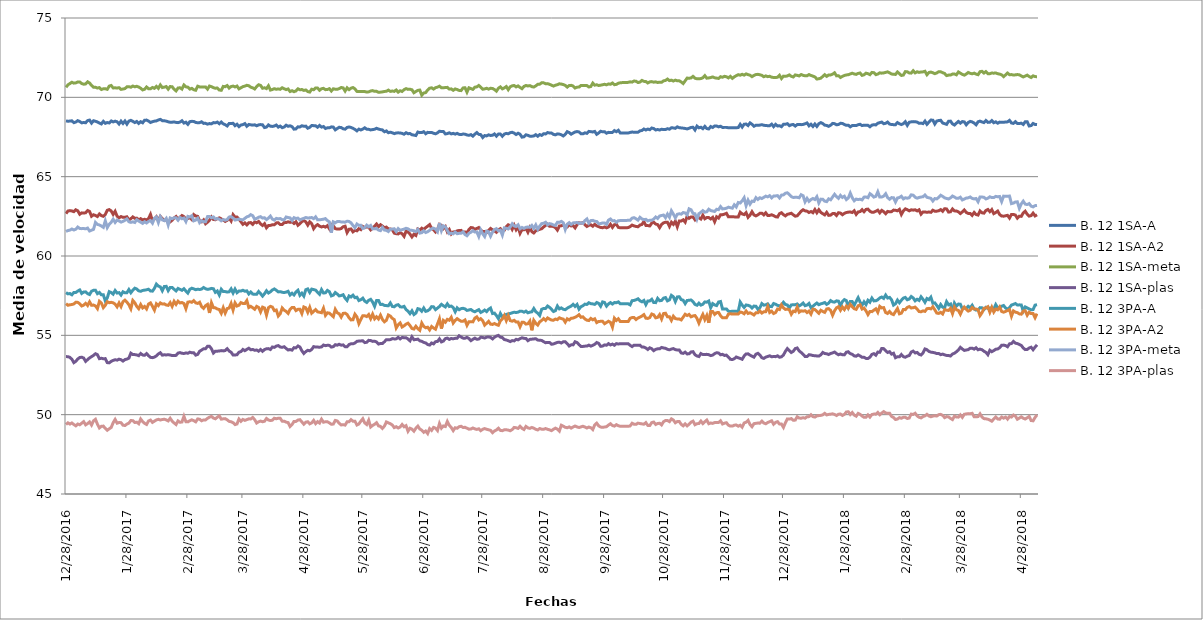
| Category | B. 12 1SA-A | B. 12 1SA-A2 | B. 12 1SA-meta | B. 12 1SA-plas | B. 12 3PA-A | B. 12 3PA-A2 | B. 12 3PA-meta | B. 12 3PA-plas |
|---|---|---|---|---|---|---|---|---|
| 28/12/2016 | 68.518 | 62.671 | 70.632 | 53.658 | 57.693 | 56.996 | 61.549 | 49.381 |
| 29/12/2016 | 68.494 | 62.836 | 70.789 | 53.657 | 57.614 | 56.893 | 61.604 | 49.485 |
| 30/12/2016 | 68.504 | 62.859 | 70.868 | 53.612 | 57.634 | 56.926 | 61.632 | 49.408 |
| 31/12/2016 | 68.52 | 62.84 | 70.95 | 53.494 | 57.553 | 56.941 | 61.7 | 49.478 |
| 01/01/2017 | 68.403 | 62.795 | 70.894 | 53.278 | 57.699 | 56.978 | 61.64 | 49.378 |
| 02/01/2017 | 68.444 | 62.913 | 70.912 | 53.364 | 57.697 | 57.085 | 61.688 | 49.295 |
| 03/01/2017 | 68.531 | 62.849 | 70.971 | 53.509 | 57.791 | 57.077 | 61.824 | 49.409 |
| 04/01/2017 | 68.473 | 62.631 | 70.966 | 53.603 | 57.861 | 56.989 | 61.736 | 49.364 |
| 05/01/2017 | 68.39 | 62.718 | 70.87 | 53.621 | 57.641 | 56.849 | 61.724 | 49.462 |
| 06/01/2017 | 68.415 | 62.706 | 70.827 | 53.57 | 57.732 | 56.904 | 61.732 | 49.56 |
| 07/01/2017 | 68.396 | 62.727 | 70.843 | 53.36 | 57.739 | 57.015 | 61.712 | 49.359 |
| 08/01/2017 | 68.533 | 62.865 | 70.979 | 53.47 | 57.629 | 56.882 | 61.76 | 49.44 |
| 09/01/2017 | 68.564 | 62.805 | 70.902 | 53.579 | 57.571 | 57.11 | 61.576 | 49.541 |
| 10/01/2017 | 68.376 | 62.505 | 70.751 | 53.657 | 57.78 | 56.893 | 61.628 | 49.346 |
| 11/01/2017 | 68.525 | 62.599 | 70.635 | 53.737 | 57.837 | 56.908 | 61.675 | 49.611 |
| 12/01/2017 | 68.49 | 62.555 | 70.634 | 53.84 | 57.841 | 56.853 | 62.118 | 49.708 |
| 13/01/2017 | 68.447 | 62.486 | 70.586 | 53.784 | 57.627 | 56.684 | 61.988 | 49.4 |
| 14/01/2017 | 68.384 | 62.651 | 70.613 | 53.528 | 57.703 | 57.143 | 61.957 | 49.166 |
| 15/01/2017 | 68.323 | 62.546 | 70.494 | 53.555 | 57.553 | 57.037 | 61.888 | 49.267 |
| 16/01/2017 | 68.486 | 62.502 | 70.538 | 53.524 | 57.561 | 56.746 | 61.806 | 49.279 |
| 17/01/2017 | 68.363 | 62.618 | 70.541 | 53.532 | 57.168 | 56.893 | 62.217 | 49.133 |
| 18/01/2017 | 68.412 | 62.881 | 70.504 | 53.28 | 57.362 | 57.121 | 61.791 | 49.018 |
| 19/01/2017 | 68.387 | 62.925 | 70.707 | 53.266 | 57.754 | 57.055 | 62.004 | 49.11 |
| 20/01/2017 | 68.511 | 62.838 | 70.747 | 53.362 | 57.697 | 57.081 | 62.124 | 49.194 |
| 21/01/2017 | 68.449 | 62.623 | 70.592 | 53.421 | 57.595 | 57.048 | 62.319 | 49.493 |
| 22/01/2017 | 68.499 | 62.817 | 70.599 | 53.461 | 57.824 | 56.967 | 62.115 | 49.698 |
| 23/01/2017 | 68.459 | 62.507 | 70.586 | 53.439 | 57.665 | 56.798 | 62.265 | 49.463 |
| 24/01/2017 | 68.32 | 62.409 | 70.609 | 53.498 | 57.691 | 57.04 | 62.212 | 49.504 |
| 25/01/2017 | 68.497 | 62.484 | 70.501 | 53.464 | 57.539 | 56.812 | 62.136 | 49.496 |
| 26/01/2017 | 68.353 | 62.436 | 70.524 | 53.377 | 57.746 | 57.121 | 62.18 | 49.336 |
| 27/01/2017 | 68.508 | 62.444 | 70.55 | 53.473 | 57.684 | 57.219 | 62.252 | 49.315 |
| 28/01/2017 | 68.312 | 62.472 | 70.663 | 53.503 | 57.689 | 57.095 | 62.338 | 49.409 |
| 29/01/2017 | 68.501 | 62.276 | 70.674 | 53.562 | 57.886 | 56.927 | 62.158 | 49.463 |
| 30/01/2017 | 68.549 | 62.35 | 70.635 | 53.874 | 57.685 | 56.675 | 62.12 | 49.632 |
| 31/01/2017 | 68.486 | 62.463 | 70.712 | 53.789 | 57.844 | 57.197 | 62.154 | 49.622 |
| 01/02/2017 | 68.411 | 62.374 | 70.664 | 53.786 | 57.972 | 57.055 | 62.112 | 49.504 |
| 02/02/2017 | 68.48 | 62.387 | 70.695 | 53.765 | 57.92 | 56.825 | 62.287 | 49.526 |
| 03/02/2017 | 68.355 | 62.273 | 70.647 | 53.718 | 57.804 | 56.679 | 62.201 | 49.431 |
| 04/02/2017 | 68.464 | 62.353 | 70.574 | 53.856 | 57.775 | 56.942 | 62.131 | 49.724 |
| 05/02/2017 | 68.395 | 62.274 | 70.468 | 53.76 | 57.828 | 56.726 | 62.056 | 49.562 |
| 06/02/2017 | 68.558 | 62.316 | 70.507 | 53.743 | 57.848 | 56.821 | 62.16 | 49.453 |
| 07/02/2017 | 68.566 | 62.267 | 70.653 | 53.849 | 57.871 | 56.664 | 62.082 | 49.383 |
| 08/02/2017 | 68.504 | 62.363 | 70.543 | 53.716 | 57.905 | 56.971 | 62.181 | 49.604 |
| 09/02/2017 | 68.414 | 62.62 | 70.54 | 53.611 | 57.794 | 57.044 | 62.228 | 49.658 |
| 10/02/2017 | 68.465 | 62.214 | 70.622 | 53.593 | 57.786 | 56.832 | 62.07 | 49.513 |
| 11/02/2017 | 68.498 | 62.335 | 70.566 | 53.629 | 57.961 | 56.588 | 62.375 | 49.592 |
| 12/02/2017 | 68.515 | 62.473 | 70.694 | 53.704 | 58.232 | 56.989 | 62.456 | 49.669 |
| 13/02/2017 | 68.574 | 62.259 | 70.566 | 53.827 | 58.105 | 56.872 | 62.107 | 49.707 |
| 14/02/2017 | 68.61 | 62.493 | 70.78 | 53.903 | 58.053 | 57.044 | 62.478 | 49.663 |
| 15/02/2017 | 68.529 | 62.365 | 70.616 | 53.752 | 57.81 | 56.971 | 62.276 | 49.694 |
| 16/02/2017 | 68.523 | 62.245 | 70.641 | 53.774 | 58.075 | 56.985 | 62.228 | 49.713 |
| 17/02/2017 | 68.499 | 62.285 | 70.68 | 53.763 | 58.088 | 56.909 | 62.369 | 49.672 |
| 18/02/2017 | 68.457 | 62.186 | 70.514 | 53.782 | 57.818 | 56.889 | 61.956 | 49.605 |
| 19/02/2017 | 68.432 | 62.152 | 70.679 | 53.761 | 58.016 | 57.061 | 62.399 | 49.771 |
| 20/02/2017 | 68.434 | 62.251 | 70.67 | 53.724 | 58.019 | 56.824 | 62.351 | 49.595 |
| 21/02/2017 | 68.448 | 62.396 | 70.512 | 53.721 | 57.905 | 57.14 | 62.413 | 49.478 |
| 22/02/2017 | 68.42 | 62.489 | 70.407 | 53.738 | 57.8 | 56.953 | 62.407 | 49.378 |
| 23/02/2017 | 68.405 | 62.314 | 70.586 | 53.882 | 57.956 | 57.151 | 62.257 | 49.607 |
| 24/02/2017 | 68.443 | 62.436 | 70.603 | 53.912 | 57.897 | 57.04 | 62.432 | 49.519 |
| 25/02/2017 | 68.523 | 62.551 | 70.521 | 53.871 | 57.838 | 57.068 | 62.346 | 49.54 |
| 26/02/2017 | 68.378 | 62.483 | 70.778 | 53.855 | 57.938 | 57.007 | 62.393 | 49.897 |
| 27/02/2017 | 68.432 | 62.312 | 70.662 | 53.89 | 57.79 | 56.68 | 62.171 | 49.557 |
| 28/02/2017 | 68.296 | 62.359 | 70.642 | 53.872 | 57.666 | 57.094 | 62.496 | 49.547 |
| 01/03/2017 | 68.466 | 62.425 | 70.515 | 53.937 | 57.9 | 57.119 | 62.46 | 49.617 |
| 02/03/2017 | 68.487 | 62.299 | 70.566 | 53.898 | 57.969 | 57.083 | 62.536 | 49.674 |
| 03/03/2017 | 68.48 | 62.609 | 70.479 | 53.905 | 57.93 | 57.186 | 62.215 | 49.622 |
| 04/03/2017 | 68.416 | 62.521 | 70.446 | 53.753 | 57.874 | 57.046 | 62.264 | 49.548 |
| 05/03/2017 | 68.399 | 62.498 | 70.703 | 53.798 | 57.908 | 57.011 | 62.382 | 49.729 |
| 06/03/2017 | 68.405 | 62.208 | 70.658 | 53.997 | 57.888 | 57.082 | 62.097 | 49.711 |
| 07/03/2017 | 68.459 | 62.154 | 70.648 | 54.072 | 57.918 | 56.811 | 62.222 | 49.616 |
| 08/03/2017 | 68.358 | 62.277 | 70.657 | 54.156 | 58.013 | 56.7 | 62.156 | 49.67 |
| 09/03/2017 | 68.36 | 62.032 | 70.657 | 54.156 | 57.939 | 56.871 | 62.156 | 49.67 |
| 10/03/2017 | 68.311 | 62.131 | 70.519 | 54.311 | 57.897 | 56.95 | 62.483 | 49.767 |
| 11/03/2017 | 68.347 | 62.251 | 70.712 | 54.309 | 57.919 | 56.411 | 62.486 | 49.842 |
| 12/03/2017 | 68.329 | 62.459 | 70.674 | 54.157 | 57.957 | 57.05 | 62.408 | 49.891 |
| 13/03/2017 | 68.408 | 62.301 | 70.609 | 53.886 | 57.936 | 56.746 | 62.462 | 49.787 |
| 14/03/2017 | 68.393 | 62.287 | 70.574 | 54.003 | 57.709 | 56.732 | 62.326 | 49.74 |
| 15/03/2017 | 68.44 | 62.352 | 70.589 | 54.001 | 57.795 | 56.658 | 62.362 | 49.84 |
| 16/03/2017 | 68.337 | 62.406 | 70.463 | 54.013 | 57.547 | 56.63 | 62.312 | 49.923 |
| 17/03/2017 | 68.444 | 62.34 | 70.443 | 54.038 | 57.904 | 56.388 | 62.218 | 49.718 |
| 18/03/2017 | 68.328 | 62.271 | 70.687 | 54.019 | 57.758 | 56.738 | 62.299 | 49.739 |
| 19/03/2017 | 68.276 | 62.18 | 70.669 | 54.041 | 57.757 | 56.406 | 62.255 | 49.749 |
| 20/03/2017 | 68.193 | 62.249 | 70.743 | 54.157 | 57.73 | 56.685 | 62.295 | 49.677 |
| 21/03/2017 | 68.353 | 62.396 | 70.583 | 54.011 | 57.744 | 56.719 | 62.454 | 49.577 |
| 22/03/2017 | 68.348 | 62.209 | 70.68 | 53.936 | 57.927 | 57.01 | 62.48 | 49.553 |
| 23/03/2017 | 68.366 | 62.607 | 70.71 | 53.761 | 57.666 | 56.592 | 62.388 | 49.496 |
| 24/03/2017 | 68.213 | 62.45 | 70.656 | 53.762 | 57.914 | 57.046 | 62.266 | 49.375 |
| 25/03/2017 | 68.305 | 62.458 | 70.711 | 53.776 | 57.688 | 56.846 | 62.289 | 49.413 |
| 26/03/2017 | 68.155 | 62.316 | 70.53 | 53.936 | 57.791 | 56.899 | 62.326 | 49.724 |
| 27/03/2017 | 68.253 | 62.159 | 70.602 | 53.974 | 57.791 | 57.062 | 62.296 | 49.583 |
| 28/03/2017 | 68.28 | 61.996 | 70.674 | 54.109 | 57.84 | 57.007 | 62.278 | 49.699 |
| 29/03/2017 | 68.346 | 62.085 | 70.705 | 54.034 | 57.777 | 57.007 | 62.373 | 49.639 |
| 30/03/2017 | 68.176 | 61.958 | 70.759 | 54.114 | 57.803 | 57.19 | 62.464 | 49.687 |
| 31/03/2017 | 68.291 | 62.096 | 70.73 | 54.187 | 57.61 | 56.755 | 62.51 | 49.736 |
| 01/04/2017 | 68.268 | 62.105 | 70.64 | 54.09 | 57.731 | 56.827 | 62.607 | 49.732 |
| 02/04/2017 | 68.248 | 61.994 | 70.599 | 54.109 | 57.598 | 56.742 | 62.542 | 49.823 |
| 03/04/2017 | 68.267 | 62.149 | 70.525 | 54.059 | 57.592 | 56.644 | 62.318 | 49.686 |
| 04/04/2017 | 68.205 | 62.094 | 70.679 | 54.075 | 57.586 | 56.824 | 62.37 | 49.473 |
| 05/04/2017 | 68.263 | 62.174 | 70.792 | 54.002 | 57.763 | 56.758 | 62.442 | 49.55 |
| 06/04/2017 | 68.283 | 62.026 | 70.751 | 54.106 | 57.629 | 56.477 | 62.477 | 49.595 |
| 07/04/2017 | 68.269 | 61.924 | 70.572 | 53.995 | 57.472 | 56.778 | 62.39 | 49.555 |
| 08/04/2017 | 68.096 | 62.035 | 70.602 | 54.104 | 57.621 | 56.725 | 62.412 | 49.586 |
| 09/04/2017 | 68.125 | 61.779 | 70.551 | 54.152 | 57.812 | 56.275 | 62.295 | 49.759 |
| 10/04/2017 | 68.261 | 61.918 | 70.728 | 54.164 | 57.667 | 56.739 | 62.39 | 49.663 |
| 11/04/2017 | 68.182 | 61.93 | 70.458 | 54.107 | 57.745 | 56.825 | 62.513 | 49.629 |
| 12/04/2017 | 68.166 | 61.97 | 70.494 | 54.266 | 57.86 | 56.782 | 62.326 | 49.652 |
| 13/04/2017 | 68.193 | 61.968 | 70.545 | 54.241 | 57.924 | 56.555 | 62.261 | 49.774 |
| 14/04/2017 | 68.255 | 62.087 | 70.507 | 54.324 | 57.84 | 56.594 | 62.371 | 49.743 |
| 15/04/2017 | 68.123 | 62.1 | 70.531 | 54.353 | 57.738 | 56.218 | 62.342 | 49.774 |
| 16/04/2017 | 68.187 | 61.979 | 70.506 | 54.262 | 57.752 | 56.36 | 62.361 | 49.769 |
| 17/04/2017 | 68.087 | 61.986 | 70.605 | 54.243 | 57.712 | 56.724 | 62.287 | 49.59 |
| 18/04/2017 | 68.132 | 62.107 | 70.541 | 54.282 | 57.698 | 56.584 | 62.277 | 49.592 |
| 19/04/2017 | 68.244 | 62.107 | 70.487 | 54.173 | 57.725 | 56.51 | 62.458 | 49.527 |
| 20/04/2017 | 68.174 | 62.155 | 70.528 | 54.075 | 57.777 | 56.383 | 62.423 | 49.501 |
| 21/04/2017 | 68.207 | 62.121 | 70.366 | 54.103 | 57.544 | 56.64 | 62.403 | 49.256 |
| 22/04/2017 | 68.153 | 62.152 | 70.418 | 54.068 | 57.652 | 56.76 | 62.239 | 49.374 |
| 23/04/2017 | 67.996 | 62.051 | 70.355 | 54.222 | 57.545 | 56.753 | 62.416 | 49.575 |
| 24/04/2017 | 68.01 | 62.161 | 70.404 | 54.207 | 57.735 | 56.558 | 62.361 | 49.574 |
| 25/04/2017 | 68.14 | 61.935 | 70.536 | 54.331 | 57.841 | 56.64 | 62.39 | 49.66 |
| 26/04/2017 | 68.134 | 62.035 | 70.477 | 54.263 | 57.526 | 56.643 | 62.271 | 49.683 |
| 27/04/2017 | 68.208 | 62.175 | 70.492 | 54.029 | 57.656 | 56.373 | 62.335 | 49.544 |
| 28/04/2017 | 68.177 | 62.228 | 70.435 | 53.858 | 57.473 | 56.789 | 62.371 | 49.398 |
| 29/04/2017 | 68.185 | 62.155 | 70.465 | 53.974 | 57.875 | 56.732 | 62.426 | 49.527 |
| 30/04/2017 | 68.054 | 61.946 | 70.364 | 54.057 | 57.926 | 56.452 | 62.394 | 49.556 |
| 01/05/2017 | 68.108 | 62.153 | 70.332 | 54.025 | 57.706 | 56.765 | 62.406 | 49.422 |
| 02/05/2017 | 68.225 | 62.042 | 70.513 | 54.11 | 57.915 | 56.397 | 62.423 | 49.484 |
| 03/05/2017 | 68.215 | 61.723 | 70.478 | 54.288 | 57.883 | 56.51 | 62.355 | 49.639 |
| 04/05/2017 | 68.206 | 61.893 | 70.593 | 54.258 | 57.849 | 56.623 | 62.468 | 49.435 |
| 05/05/2017 | 68.116 | 61.98 | 70.586 | 54.261 | 57.711 | 56.481 | 62.277 | 49.562 |
| 06/05/2017 | 68.229 | 61.88 | 70.445 | 54.25 | 57.584 | 56.455 | 62.281 | 49.473 |
| 07/05/2017 | 68.122 | 61.831 | 70.541 | 54.272 | 57.881 | 56.426 | 62.3 | 49.714 |
| 08/05/2017 | 68.159 | 61.871 | 70.567 | 54.39 | 57.667 | 56.706 | 62.319 | 49.525 |
| 09/05/2017 | 68.039 | 61.821 | 70.484 | 54.35 | 57.682 | 56.258 | 62.358 | 49.555 |
| 10/05/2017 | 68.079 | 61.911 | 70.493 | 54.375 | 57.83 | 56.42 | 62.232 | 49.552 |
| 11/05/2017 | 68.079 | 61.715 | 70.547 | 54.367 | 57.751 | 56.398 | 62.148 | 49.482 |
| 12/05/2017 | 68.138 | 61.988 | 70.398 | 54.259 | 57.484 | 56.287 | 61.469 | 49.393 |
| 13/05/2017 | 68.124 | 61.907 | 70.538 | 54.29 | 57.533 | 56.175 | 62.155 | 49.409 |
| 14/05/2017 | 67.952 | 61.729 | 70.512 | 54.41 | 57.699 | 56.637 | 62.094 | 49.636 |
| 15/05/2017 | 68.037 | 61.695 | 70.502 | 54.378 | 57.602 | 56.424 | 62.171 | 49.601 |
| 16/05/2017 | 68.113 | 61.695 | 70.553 | 54.438 | 57.484 | 56.357 | 62.177 | 49.46 |
| 17/05/2017 | 68.095 | 61.73 | 70.618 | 54.377 | 57.509 | 56.15 | 62.145 | 49.352 |
| 18/05/2017 | 68.02 | 61.842 | 70.596 | 54.397 | 57.559 | 56.382 | 62.139 | 49.369 |
| 19/05/2017 | 67.993 | 61.878 | 70.394 | 54.282 | 57.344 | 56.398 | 62.131 | 49.343 |
| 20/05/2017 | 68.099 | 61.477 | 70.599 | 54.281 | 57.2 | 56.315 | 62.192 | 49.547 |
| 21/05/2017 | 68.13 | 61.684 | 70.483 | 54.418 | 57.483 | 56.105 | 62.176 | 49.552 |
| 22/05/2017 | 68.104 | 61.704 | 70.576 | 54.468 | 57.416 | 55.972 | 62.09 | 49.685 |
| 23/05/2017 | 68.046 | 61.523 | 70.618 | 54.465 | 57.531 | 55.984 | 61.926 | 49.589 |
| 24/05/2017 | 67.98 | 61.618 | 70.535 | 54.516 | 57.372 | 56.33 | 61.779 | 49.591 |
| 25/05/2017 | 67.885 | 61.589 | 70.374 | 54.621 | 57.403 | 56.167 | 62.016 | 49.35 |
| 26/05/2017 | 67.996 | 61.72 | 70.368 | 54.64 | 57.192 | 55.739 | 61.93 | 49.412 |
| 27/05/2017 | 67.944 | 61.663 | 70.374 | 54.648 | 57.245 | 56.003 | 61.933 | 49.591 |
| 28/05/2017 | 67.997 | 61.859 | 70.368 | 54.658 | 57.341 | 56.239 | 61.732 | 49.742 |
| 29/05/2017 | 68.08 | 61.786 | 70.364 | 54.541 | 57.154 | 56.233 | 61.79 | 49.478 |
| 30/05/2017 | 67.992 | 61.838 | 70.33 | 54.563 | 57.073 | 56.182 | 61.946 | 49.38 |
| 31/05/2017 | 67.984 | 61.814 | 70.347 | 54.684 | 57.203 | 56.309 | 61.841 | 49.647 |
| 01/06/2017 | 67.945 | 61.646 | 70.398 | 54.673 | 57.27 | 56.049 | 61.924 | 49.222 |
| 02/06/2017 | 67.966 | 61.749 | 70.423 | 54.619 | 57.098 | 56.336 | 61.71 | 49.321 |
| 03/06/2017 | 67.987 | 61.879 | 70.38 | 54.626 | 56.828 | 56.04 | 61.717 | 49.393 |
| 04/06/2017 | 68.047 | 62.018 | 70.378 | 54.584 | 57.191 | 56.17 | 61.729 | 49.491 |
| 05/06/2017 | 68.001 | 61.848 | 70.315 | 54.449 | 57.195 | 56.034 | 61.634 | 49.293 |
| 06/06/2017 | 67.966 | 61.975 | 70.328 | 54.487 | 56.946 | 56.272 | 61.599 | 49.262 |
| 07/06/2017 | 67.947 | 61.884 | 70.343 | 54.483 | 56.954 | 55.997 | 61.803 | 49.137 |
| 08/06/2017 | 67.829 | 61.789 | 70.371 | 54.596 | 56.887 | 55.852 | 61.637 | 49.278 |
| 09/06/2017 | 67.882 | 61.821 | 70.382 | 54.726 | 56.874 | 55.951 | 61.615 | 49.542 |
| 10/06/2017 | 67.769 | 61.708 | 70.454 | 54.718 | 56.863 | 56.281 | 61.541 | 49.485 |
| 11/06/2017 | 67.803 | 61.709 | 70.376 | 54.73 | 57.04 | 56.216 | 61.691 | 49.429 |
| 12/06/2017 | 67.765 | 61.659 | 70.397 | 54.792 | 56.821 | 56.071 | 61.694 | 49.353 |
| 13/06/2017 | 67.714 | 61.439 | 70.375 | 54.774 | 56.797 | 55.994 | 61.717 | 49.183 |
| 14/06/2017 | 67.756 | 61.406 | 70.463 | 54.777 | 56.9 | 55.463 | 61.541 | 49.241 |
| 15/06/2017 | 67.761 | 61.392 | 70.325 | 54.871 | 56.932 | 55.667 | 61.729 | 49.161 |
| 16/06/2017 | 67.755 | 61.475 | 70.414 | 54.776 | 56.8 | 55.781 | 61.615 | 49.222 |
| 17/06/2017 | 67.728 | 61.402 | 70.37 | 54.864 | 56.784 | 55.525 | 61.662 | 49.381 |
| 18/06/2017 | 67.676 | 61.238 | 70.487 | 54.85 | 56.826 | 55.602 | 61.694 | 49.235 |
| 19/06/2017 | 67.768 | 61.561 | 70.55 | 54.849 | 56.624 | 55.707 | 61.747 | 49.307 |
| 20/06/2017 | 67.708 | 61.51 | 70.502 | 54.772 | 56.526 | 55.765 | 61.712 | 48.955 |
| 21/06/2017 | 67.719 | 61.381 | 70.511 | 54.653 | 56.368 | 55.619 | 61.628 | 49.146 |
| 22/06/2017 | 67.643 | 61.202 | 70.476 | 54.906 | 56.546 | 55.433 | 61.619 | 49.089 |
| 23/06/2017 | 67.617 | 61.37 | 70.29 | 54.724 | 56.31 | 55.396 | 61.59 | 48.958 |
| 24/06/2017 | 67.593 | 61.293 | 70.37 | 54.733 | 56.4 | 55.573 | 61.532 | 49.144 |
| 25/06/2017 | 67.813 | 61.699 | 70.438 | 54.762 | 56.682 | 55.421 | 61.676 | 49.278 |
| 26/06/2017 | 67.776 | 61.628 | 70.458 | 54.653 | 56.649 | 55.318 | 61.442 | 49.095 |
| 27/06/2017 | 67.781 | 61.751 | 70.136 | 54.622 | 56.523 | 55.776 | 61.468 | 49.021 |
| 28/06/2017 | 67.836 | 61.666 | 70.272 | 54.555 | 56.723 | 55.563 | 61.586 | 48.887 |
| 29/06/2017 | 67.704 | 61.786 | 70.299 | 54.52 | 56.512 | 55.476 | 61.481 | 48.969 |
| 30/06/2017 | 67.792 | 61.879 | 70.464 | 54.421 | 56.548 | 55.512 | 61.532 | 48.808 |
| 01/07/2017 | 67.784 | 61.978 | 70.575 | 54.388 | 56.639 | 55.343 | 61.617 | 49.121 |
| 02/07/2017 | 67.788 | 61.746 | 70.6 | 54.516 | 56.808 | 55.557 | 61.718 | 49.009 |
| 03/07/2017 | 67.736 | 61.649 | 70.52 | 54.461 | 56.796 | 55.461 | 61.753 | 49.196 |
| 04/07/2017 | 67.702 | 61.515 | 70.607 | 54.601 | 56.622 | 55.386 | 61.695 | 49.149 |
| 05/07/2017 | 67.761 | 61.674 | 70.644 | 54.613 | 56.715 | 55.714 | 61.535 | 49 |
| 06/07/2017 | 67.864 | 61.999 | 70.704 | 54.777 | 56.817 | 56.042 | 62.076 | 49.438 |
| 07/07/2017 | 67.844 | 61.932 | 70.602 | 54.584 | 56.955 | 55.425 | 61.597 | 49.15 |
| 08/07/2017 | 67.847 | 61.728 | 70.607 | 54.638 | 56.864 | 55.937 | 61.899 | 49.289 |
| 09/07/2017 | 67.694 | 61.854 | 70.616 | 54.796 | 56.789 | 55.826 | 61.84 | 49.251 |
| 10/07/2017 | 67.715 | 61.519 | 70.628 | 54.824 | 56.986 | 56.006 | 61.61 | 49.57 |
| 11/07/2017 | 67.765 | 61.671 | 70.519 | 54.744 | 56.816 | 55.952 | 61.403 | 49.327 |
| 12/07/2017 | 67.697 | 61.392 | 70.533 | 54.802 | 56.846 | 56.137 | 61.441 | 49.195 |
| 13/07/2017 | 67.728 | 61.515 | 70.444 | 54.783 | 56.749 | 55.774 | 61.4 | 48.996 |
| 14/07/2017 | 67.682 | 61.529 | 70.528 | 54.811 | 56.487 | 55.94 | 61.509 | 49.176 |
| 15/07/2017 | 67.73 | 61.585 | 70.492 | 54.816 | 56.729 | 56.051 | 61.403 | 49.143 |
| 16/07/2017 | 67.667 | 61.608 | 70.436 | 54.971 | 56.613 | 55.964 | 61.431 | 49.241 |
| 17/07/2017 | 67.652 | 61.614 | 70.425 | 54.895 | 56.683 | 55.887 | 61.428 | 49.269 |
| 18/07/2017 | 67.685 | 61.489 | 70.593 | 54.824 | 56.703 | 55.89 | 61.522 | 49.195 |
| 19/07/2017 | 67.679 | 61.515 | 70.606 | 54.817 | 56.667 | 55.967 | 61.354 | 49.201 |
| 20/07/2017 | 67.626 | 61.467 | 70.325 | 54.87 | 56.57 | 55.634 | 61.276 | 49.146 |
| 21/07/2017 | 67.607 | 61.666 | 70.601 | 54.799 | 56.6 | 55.861 | 61.432 | 49.086 |
| 22/07/2017 | 67.649 | 61.793 | 70.551 | 54.663 | 56.628 | 55.859 | 61.497 | 49.095 |
| 23/07/2017 | 67.555 | 61.774 | 70.501 | 54.752 | 56.534 | 55.85 | 61.596 | 49.162 |
| 24/07/2017 | 67.678 | 61.675 | 70.637 | 54.823 | 56.484 | 56.079 | 61.509 | 49.106 |
| 25/07/2017 | 67.778 | 61.736 | 70.658 | 54.754 | 56.557 | 56.163 | 61.519 | 49.071 |
| 26/07/2017 | 67.667 | 61.792 | 70.747 | 54.763 | 56.618 | 55.968 | 61.231 | 49.112 |
| 27/07/2017 | 67.65 | 61.625 | 70.643 | 54.878 | 56.442 | 56.049 | 61.642 | 48.993 |
| 28/07/2017 | 67.471 | 61.542 | 70.51 | 54.867 | 56.507 | 55.925 | 61.398 | 49.079 |
| 29/07/2017 | 67.591 | 61.546 | 70.533 | 54.829 | 56.592 | 55.645 | 61.228 | 49.125 |
| 30/07/2017 | 67.567 | 61.475 | 70.574 | 54.885 | 56.496 | 55.757 | 61.571 | 49.08 |
| 31/07/2017 | 67.636 | 61.618 | 70.516 | 54.897 | 56.642 | 55.882 | 61.528 | 49.046 |
| 01/08/2017 | 67.596 | 61.736 | 70.569 | 54.872 | 56.722 | 55.704 | 61.25 | 49.012 |
| 02/08/2017 | 67.611 | 61.65 | 70.56 | 54.774 | 56.373 | 55.688 | 61.506 | 48.864 |
| 03/08/2017 | 67.693 | 61.581 | 70.489 | 54.883 | 56.397 | 55.746 | 61.667 | 48.975 |
| 04/08/2017 | 67.553 | 61.495 | 70.39 | 54.956 | 56.245 | 55.679 | 61.724 | 49.037 |
| 05/08/2017 | 67.688 | 61.651 | 70.574 | 54.995 | 56.051 | 55.633 | 61.583 | 49.145 |
| 06/08/2017 | 67.683 | 61.724 | 70.66 | 54.884 | 56.378 | 55.916 | 61.629 | 49.007 |
| 07/08/2017 | 67.549 | 61.577 | 70.534 | 54.862 | 56.158 | 56.032 | 61.319 | 48.99 |
| 08/08/2017 | 67.685 | 61.624 | 70.591 | 54.733 | 56.245 | 56.25 | 61.773 | 49.049 |
| 09/08/2017 | 67.727 | 61.841 | 70.679 | 54.707 | 56.319 | 55.928 | 61.745 | 49.049 |
| 10/08/2017 | 67.702 | 61.968 | 70.483 | 54.662 | 56.354 | 56.244 | 61.703 | 49.028 |
| 11/08/2017 | 67.772 | 61.909 | 70.666 | 54.607 | 56.377 | 55.928 | 61.825 | 48.987 |
| 12/08/2017 | 67.799 | 61.678 | 70.726 | 54.668 | 56.419 | 55.891 | 62.03 | 49.061 |
| 13/08/2017 | 67.741 | 61.939 | 70.745 | 54.649 | 56.457 | 55.945 | 61.895 | 49.195 |
| 14/08/2017 | 67.657 | 61.656 | 70.658 | 54.747 | 56.437 | 55.84 | 61.858 | 49.178 |
| 15/08/2017 | 67.737 | 61.841 | 70.721 | 54.716 | 56.464 | 55.843 | 61.967 | 49.136 |
| 16/08/2017 | 67.675 | 61.429 | 70.624 | 54.79 | 56.525 | 55.543 | 61.711 | 49.268 |
| 17/08/2017 | 67.492 | 61.664 | 70.544 | 54.845 | 56.517 | 55.826 | 61.801 | 49.135 |
| 18/08/2017 | 67.514 | 61.651 | 70.691 | 54.81 | 56.458 | 55.817 | 61.741 | 49.065 |
| 19/08/2017 | 67.638 | 61.737 | 70.746 | 54.804 | 56.526 | 55.709 | 61.81 | 49.259 |
| 20/08/2017 | 67.605 | 61.496 | 70.717 | 54.662 | 56.421 | 55.731 | 61.828 | 49.167 |
| 21/08/2017 | 67.552 | 61.788 | 70.739 | 54.746 | 56.462 | 55.901 | 61.807 | 49.138 |
| 22/08/2017 | 67.549 | 61.534 | 70.673 | 54.759 | 56.483 | 55.318 | 61.925 | 49.194 |
| 23/08/2017 | 67.566 | 61.452 | 70.65 | 54.773 | 56.69 | 55.943 | 61.743 | 49.148 |
| 24/08/2017 | 67.647 | 61.59 | 70.724 | 54.787 | 56.49 | 55.764 | 61.958 | 49.075 |
| 25/08/2017 | 67.549 | 61.638 | 70.818 | 54.7 | 56.397 | 55.645 | 61.68 | 49.038 |
| 26/08/2017 | 67.653 | 61.684 | 70.83 | 54.694 | 56.253 | 55.852 | 61.88 | 49.126 |
| 27/08/2017 | 67.601 | 61.721 | 70.918 | 54.678 | 56.642 | 55.938 | 62.039 | 49.083 |
| 28/08/2017 | 67.707 | 61.829 | 70.914 | 54.601 | 56.694 | 56.06 | 62.066 | 49.081 |
| 29/08/2017 | 67.691 | 61.929 | 70.857 | 54.535 | 56.694 | 55.938 | 62.129 | 49.126 |
| 30/08/2017 | 67.779 | 62.008 | 70.864 | 54.554 | 56.847 | 56.096 | 61.961 | 49.077 |
| 31/08/2017 | 67.755 | 61.874 | 70.82 | 54.554 | 56.762 | 56.025 | 62.042 | 49.044 |
| 01/09/2017 | 67.75 | 61.881 | 70.767 | 54.438 | 56.639 | 55.961 | 62.012 | 48.994 |
| 02/09/2017 | 67.664 | 61.857 | 70.709 | 54.458 | 56.5 | 55.955 | 61.955 | 49.081 |
| 03/09/2017 | 67.637 | 61.787 | 70.764 | 54.506 | 56.554 | 56.025 | 61.922 | 49.151 |
| 04/09/2017 | 67.696 | 61.631 | 70.796 | 54.556 | 56.848 | 55.989 | 62.126 | 49.084 |
| 05/09/2017 | 67.681 | 61.892 | 70.853 | 54.565 | 56.666 | 56.107 | 62.12 | 48.966 |
| 06/09/2017 | 67.64 | 61.903 | 70.835 | 54.517 | 56.727 | 56.053 | 62.183 | 49.333 |
| 07/09/2017 | 67.567 | 61.946 | 70.805 | 54.594 | 56.645 | 56.022 | 62.095 | 49.272 |
| 08/09/2017 | 67.667 | 61.866 | 70.754 | 54.597 | 56.617 | 55.831 | 61.673 | 49.204 |
| 09/09/2017 | 67.839 | 61.832 | 70.645 | 54.479 | 56.709 | 56.042 | 62.009 | 49.176 |
| 10/09/2017 | 67.779 | 61.988 | 70.744 | 54.327 | 56.783 | 55.969 | 62.101 | 49.229 |
| 11/09/2017 | 67.677 | 61.894 | 70.755 | 54.402 | 56.843 | 56.076 | 61.985 | 49.152 |
| 12/09/2017 | 67.75 | 61.916 | 70.712 | 54.399 | 56.953 | 56.087 | 62.086 | 49.227 |
| 13/09/2017 | 67.814 | 61.771 | 70.589 | 54.595 | 56.821 | 56.14 | 62.098 | 49.283 |
| 14/09/2017 | 67.844 | 61.978 | 70.642 | 54.543 | 56.946 | 56.205 | 62.113 | 49.229 |
| 15/09/2017 | 67.818 | 62.094 | 70.645 | 54.412 | 56.654 | 56.301 | 62.048 | 49.191 |
| 16/09/2017 | 67.708 | 62.067 | 70.748 | 54.298 | 56.809 | 56.138 | 62.092 | 49.231 |
| 17/09/2017 | 67.702 | 62.105 | 70.753 | 54.3 | 56.864 | 56.166 | 62.057 | 49.269 |
| 18/09/2017 | 67.763 | 61.967 | 70.747 | 54.32 | 56.966 | 56.031 | 62.229 | 49.22 |
| 19/09/2017 | 67.731 | 61.864 | 70.741 | 54.321 | 56.945 | 55.955 | 62.334 | 49.161 |
| 20/09/2017 | 67.852 | 61.935 | 70.653 | 54.383 | 57.054 | 55.932 | 62.074 | 49.219 |
| 21/09/2017 | 67.836 | 61.966 | 70.683 | 54.318 | 56.997 | 56.068 | 62.231 | 49.179 |
| 22/09/2017 | 67.818 | 61.876 | 70.896 | 54.371 | 56.98 | 55.98 | 62.246 | 49.064 |
| 23/09/2017 | 67.852 | 61.993 | 70.768 | 54.433 | 56.95 | 56.042 | 62.186 | 49.355 |
| 24/09/2017 | 67.67 | 61.898 | 70.792 | 54.547 | 57.07 | 55.805 | 62.178 | 49.464 |
| 25/09/2017 | 67.754 | 61.849 | 70.745 | 54.492 | 57.012 | 55.873 | 62.038 | 49.294 |
| 26/09/2017 | 67.862 | 61.799 | 70.766 | 54.307 | 56.835 | 55.882 | 62.041 | 49.217 |
| 27/09/2017 | 67.825 | 61.781 | 70.794 | 54.325 | 57.108 | 55.882 | 62.083 | 49.206 |
| 28/09/2017 | 67.834 | 61.828 | 70.822 | 54.397 | 57.069 | 55.733 | 62.083 | 49.22 |
| 29/09/2017 | 67.74 | 61.775 | 70.786 | 54.374 | 56.842 | 55.812 | 61.997 | 49.243 |
| 30/09/2017 | 67.792 | 61.829 | 70.847 | 54.478 | 56.979 | 55.888 | 62.262 | 49.346 |
| 01/10/2017 | 67.787 | 61.999 | 70.823 | 54.395 | 57.062 | 55.817 | 62.332 | 49.429 |
| 02/10/2017 | 67.789 | 61.803 | 70.904 | 54.448 | 56.972 | 55.514 | 62.221 | 49.317 |
| 03/10/2017 | 67.904 | 61.972 | 70.797 | 54.374 | 57.065 | 56.081 | 62.229 | 49.278 |
| 04/10/2017 | 67.834 | 61.998 | 70.816 | 54.478 | 57.057 | 55.936 | 62.126 | 49.37 |
| 05/10/2017 | 67.922 | 61.806 | 70.89 | 54.453 | 57.108 | 56.045 | 62.224 | 49.302 |
| 06/10/2017 | 67.752 | 61.773 | 70.918 | 54.473 | 56.988 | 55.866 | 62.232 | 49.269 |
| 07/10/2017 | 67.752 | 61.778 | 70.929 | 54.473 | 56.988 | 55.866 | 62.232 | 49.269 |
| 08/10/2017 | 67.752 | 61.778 | 70.929 | 54.473 | 56.988 | 55.866 | 62.232 | 49.269 |
| 09/10/2017 | 67.752 | 61.778 | 70.929 | 54.473 | 56.988 | 55.866 | 62.232 | 49.269 |
| 10/10/2017 | 67.752 | 61.792 | 70.945 | 54.473 | 56.988 | 55.866 | 62.26 | 49.269 |
| 11/10/2017 | 67.787 | 61.854 | 70.976 | 54.371 | 56.918 | 56.073 | 62.249 | 49.288 |
| 12/10/2017 | 67.811 | 61.949 | 70.96 | 54.291 | 57.183 | 56.12 | 62.386 | 49.459 |
| 13/10/2017 | 67.801 | 61.896 | 71.029 | 54.383 | 57.199 | 56.117 | 62.415 | 49.399 |
| 14/10/2017 | 67.796 | 61.862 | 71.014 | 54.382 | 57.24 | 55.997 | 62.345 | 49.389 |
| 15/10/2017 | 67.802 | 61.841 | 70.931 | 54.371 | 57.304 | 56.092 | 62.26 | 49.466 |
| 16/10/2017 | 67.887 | 61.949 | 70.959 | 54.381 | 57.174 | 56.145 | 62.439 | 49.439 |
| 17/10/2017 | 67.91 | 61.988 | 71.067 | 54.263 | 57.113 | 56.218 | 62.336 | 49.42 |
| 18/10/2017 | 68.003 | 62.173 | 71.006 | 54.258 | 57.198 | 56.304 | 62.292 | 49.398 |
| 19/10/2017 | 67.94 | 61.925 | 70.998 | 54.202 | 56.934 | 56.081 | 62.31 | 49.499 |
| 20/10/2017 | 67.999 | 61.919 | 70.905 | 54.109 | 57.167 | 56.064 | 62.216 | 49.322 |
| 21/10/2017 | 67.961 | 61.894 | 70.975 | 54.216 | 57.169 | 56.123 | 62.253 | 49.314 |
| 22/10/2017 | 68.067 | 62.077 | 70.991 | 54.156 | 57.272 | 56.344 | 62.259 | 49.5 |
| 23/10/2017 | 68.032 | 62.126 | 70.955 | 54.036 | 57.066 | 56.296 | 62.324 | 49.534 |
| 24/10/2017 | 67.945 | 62.014 | 70.975 | 54.116 | 57.062 | 56.103 | 62.458 | 49.382 |
| 25/10/2017 | 67.971 | 61.98 | 70.937 | 54.148 | 57.328 | 56.131 | 62.369 | 49.441 |
| 26/10/2017 | 67.941 | 61.784 | 70.955 | 54.149 | 57.182 | 56.304 | 62.52 | 49.462 |
| 27/10/2017 | 67.988 | 61.991 | 70.947 | 54.236 | 57.196 | 56.028 | 62.553 | 49.355 |
| 28/10/2017 | 67.969 | 62.091 | 71.039 | 54.204 | 57.344 | 56.372 | 62.581 | 49.558 |
| 29/10/2017 | 67.969 | 62.129 | 71.064 | 54.181 | 57.38 | 56.393 | 62.413 | 49.631 |
| 30/10/2017 | 68.024 | 62.127 | 71.151 | 54.116 | 57.171 | 56.168 | 62.645 | 49.631 |
| 31/10/2017 | 67.99 | 61.868 | 71.054 | 54.088 | 57.233 | 56.173 | 62.447 | 49.562 |
| 01/11/2017 | 68.082 | 62.128 | 71.082 | 54.135 | 57.521 | 55.941 | 62.847 | 49.735 |
| 02/11/2017 | 68.072 | 61.997 | 71.027 | 54.164 | 57.43 | 56.205 | 62.64 | 49.662 |
| 03/11/2017 | 68.046 | 62.197 | 71.084 | 54.102 | 57.13 | 56.059 | 62.409 | 49.49 |
| 04/11/2017 | 68.14 | 61.839 | 71.04 | 54.075 | 57.42 | 56.031 | 62.629 | 49.569 |
| 05/11/2017 | 68.085 | 62.207 | 71.043 | 54.074 | 57.433 | 56.037 | 62.662 | 49.568 |
| 06/11/2017 | 68.072 | 62.204 | 70.968 | 53.889 | 57.249 | 55.972 | 62.637 | 49.388 |
| 07/11/2017 | 68.058 | 62.28 | 70.87 | 53.863 | 57.213 | 56.149 | 62.738 | 49.296 |
| 08/11/2017 | 68.039 | 62.133 | 71.039 | 53.941 | 57 | 56.329 | 62.711 | 49.422 |
| 09/11/2017 | 68.007 | 62.501 | 71.214 | 53.828 | 57.194 | 56.25 | 62.592 | 49.295 |
| 10/11/2017 | 68.052 | 62.376 | 71.201 | 53.837 | 57.211 | 56.317 | 62.973 | 49.4 |
| 11/11/2017 | 68.102 | 62.463 | 71.223 | 53.952 | 57.228 | 56.166 | 62.914 | 49.532 |
| 12/11/2017 | 68.113 | 62.458 | 71.319 | 53.97 | 57.118 | 56.222 | 62.688 | 49.594 |
| 13/11/2017 | 67.944 | 62.284 | 71.203 | 53.779 | 56.951 | 56.247 | 62.661 | 49.365 |
| 14/11/2017 | 68.186 | 62.451 | 71.168 | 53.7 | 56.897 | 56.07 | 62.322 | 49.431 |
| 15/11/2017 | 68.079 | 62.412 | 71.169 | 53.663 | 57.026 | 55.77 | 62.668 | 49.443 |
| 16/11/2017 | 68.115 | 62.331 | 71.182 | 53.852 | 56.904 | 56.062 | 62.753 | 49.596 |
| 17/11/2017 | 68.024 | 62.568 | 71.23 | 53.789 | 56.957 | 56.315 | 62.859 | 49.438 |
| 18/11/2017 | 68.169 | 62.346 | 71.366 | 53.795 | 57.105 | 55.992 | 62.761 | 49.553 |
| 19/11/2017 | 68.032 | 62.422 | 71.207 | 53.801 | 57.089 | 56.25 | 62.79 | 49.659 |
| 20/11/2017 | 68.008 | 62.422 | 71.223 | 53.783 | 57.161 | 55.792 | 62.949 | 49.428 |
| 21/11/2017 | 68.16 | 62.334 | 71.248 | 53.722 | 56.739 | 56.506 | 62.862 | 49.475 |
| 22/11/2017 | 68.1 | 62.435 | 71.285 | 53.754 | 56.999 | 56.5 | 62.833 | 49.451 |
| 23/11/2017 | 68.196 | 62.158 | 71.233 | 53.848 | 56.916 | 56.317 | 62.807 | 49.501 |
| 24/11/2017 | 68.194 | 62.471 | 71.211 | 53.904 | 56.874 | 56.427 | 62.944 | 49.512 |
| 25/11/2017 | 68.14 | 62.389 | 71.19 | 53.886 | 57.102 | 56.441 | 62.921 | 49.507 |
| 26/11/2017 | 68.178 | 62.601 | 71.299 | 53.774 | 57.131 | 56.239 | 63.113 | 49.61 |
| 27/11/2017 | 68.104 | 62.604 | 71.266 | 53.801 | 56.662 | 56.11 | 62.969 | 49.413 |
| 28/11/2017 | 68.107 | 62.636 | 71.322 | 53.73 | 56.662 | 56.11 | 62.985 | 49.463 |
| 29/11/2017 | 68.107 | 62.691 | 71.296 | 53.754 | 56.662 | 56.11 | 63.01 | 49.493 |
| 30/11/2017 | 68.08 | 62.468 | 71.226 | 53.622 | 56.522 | 56.337 | 63.077 | 49.335 |
| 01/12/2017 | 68.08 | 62.476 | 71.325 | 53.491 | 56.496 | 56.364 | 63.044 | 49.279 |
| 02/12/2017 | 68.08 | 62.476 | 71.195 | 53.474 | 56.522 | 56.337 | 63.013 | 49.278 |
| 03/12/2017 | 68.089 | 62.465 | 71.29 | 53.525 | 56.522 | 56.337 | 63.228 | 49.335 |
| 04/12/2017 | 68.087 | 62.453 | 71.365 | 53.634 | 56.522 | 56.337 | 63.095 | 49.351 |
| 05/12/2017 | 68.094 | 62.454 | 71.429 | 53.587 | 56.496 | 56.338 | 63.371 | 49.274 |
| 06/12/2017 | 68.296 | 62.76 | 71.396 | 53.543 | 57.098 | 56.469 | 63.34 | 49.334 |
| 07/12/2017 | 68.126 | 62.652 | 71.452 | 53.491 | 56.907 | 56.441 | 63.477 | 49.215 |
| 08/12/2017 | 68.305 | 62.612 | 71.398 | 53.698 | 56.758 | 56.36 | 63.669 | 49.478 |
| 09/12/2017 | 68.316 | 62.731 | 71.478 | 53.825 | 56.913 | 56.534 | 63.174 | 49.522 |
| 10/12/2017 | 68.222 | 62.438 | 71.43 | 53.834 | 56.892 | 56.377 | 63.517 | 49.64 |
| 11/12/2017 | 68.389 | 62.576 | 71.393 | 53.751 | 56.844 | 56.422 | 63.269 | 49.379 |
| 12/12/2017 | 68.302 | 62.79 | 71.304 | 53.689 | 56.72 | 56.36 | 63.46 | 49.241 |
| 13/12/2017 | 68.176 | 62.588 | 71.383 | 53.624 | 56.842 | 56.282 | 63.438 | 49.432 |
| 14/12/2017 | 68.239 | 62.528 | 71.435 | 53.81 | 56.837 | 56.425 | 63.677 | 49.454 |
| 15/12/2017 | 68.235 | 62.597 | 71.449 | 53.865 | 56.637 | 56.419 | 63.565 | 49.471 |
| 16/12/2017 | 68.25 | 62.689 | 71.423 | 53.761 | 56.742 | 56.539 | 63.671 | 49.463 |
| 17/12/2017 | 68.276 | 62.7 | 71.387 | 53.592 | 57.001 | 56.402 | 63.621 | 49.591 |
| 18/12/2017 | 68.239 | 62.593 | 71.298 | 53.545 | 56.9 | 56.483 | 63.696 | 49.474 |
| 19/12/2017 | 68.225 | 62.72 | 71.351 | 53.625 | 56.923 | 56.492 | 63.772 | 49.428 |
| 20/12/2017 | 68.213 | 62.558 | 71.304 | 53.67 | 56.983 | 56.813 | 63.728 | 49.507 |
| 21/12/2017 | 68.215 | 62.559 | 71.329 | 53.708 | 56.821 | 56.439 | 63.804 | 49.559 |
| 22/12/2017 | 68.308 | 62.598 | 71.269 | 53.646 | 56.81 | 56.52 | 63.664 | 49.613 |
| 23/12/2017 | 68.153 | 62.543 | 71.249 | 53.668 | 57.005 | 56.374 | 63.777 | 49.397 |
| 24/12/2017 | 68.298 | 62.478 | 71.249 | 53.656 | 56.96 | 56.439 | 63.787 | 49.515 |
| 25/12/2017 | 68.194 | 62.457 | 71.265 | 53.71 | 56.889 | 56.658 | 63.804 | 49.559 |
| 26/12/2017 | 68.212 | 62.671 | 71.389 | 53.617 | 56.855 | 56.625 | 63.66 | 49.407 |
| 27/12/2017 | 68.15 | 62.726 | 71.184 | 53.648 | 56.91 | 56.917 | 63.837 | 49.405 |
| 28/12/2017 | 68.3 | 62.609 | 71.335 | 53.76 | 57.082 | 56.731 | 63.853 | 49.198 |
| 29/12/2017 | 68.303 | 62.529 | 71.324 | 53.991 | 56.942 | 56.633 | 63.956 | 49.491 |
| 30/12/2017 | 68.337 | 62.631 | 71.351 | 54.169 | 56.911 | 56.653 | 63.985 | 49.731 |
| 31/12/2017 | 68.213 | 62.656 | 71.415 | 54.043 | 56.732 | 56.617 | 63.868 | 49.72 |
| 01/01/2018 | 68.268 | 62.694 | 71.324 | 53.921 | 56.918 | 56.331 | 63.741 | 49.751 |
| 02/01/2018 | 68.29 | 62.596 | 71.281 | 53.997 | 56.925 | 56.525 | 63.688 | 49.646 |
| 03/01/2018 | 68.189 | 62.509 | 71.413 | 54.166 | 56.932 | 56.492 | 63.7 | 49.657 |
| 04/01/2018 | 68.283 | 62.537 | 71.386 | 54.204 | 56.974 | 56.783 | 63.698 | 49.868 |
| 05/01/2018 | 68.295 | 62.67 | 71.35 | 54.02 | 56.856 | 56.458 | 63.671 | 49.787 |
| 06/01/2018 | 68.277 | 62.821 | 71.437 | 53.919 | 56.927 | 56.544 | 63.863 | 49.777 |
| 07/01/2018 | 68.293 | 62.914 | 71.386 | 53.803 | 57.035 | 56.522 | 63.798 | 49.809 |
| 08/01/2018 | 68.332 | 62.844 | 71.358 | 53.669 | 56.869 | 56.553 | 63.415 | 49.778 |
| 09/01/2018 | 68.386 | 62.827 | 71.359 | 53.661 | 56.909 | 56.436 | 63.632 | 49.868 |
| 10/01/2018 | 68.205 | 62.741 | 71.433 | 53.781 | 57.01 | 56.528 | 63.444 | 49.877 |
| 11/01/2018 | 68.305 | 62.803 | 71.378 | 53.764 | 56.745 | 56.339 | 63.556 | 49.996 |
| 12/01/2018 | 68.165 | 62.728 | 71.336 | 53.723 | 56.831 | 56.653 | 63.624 | 49.875 |
| 13/01/2018 | 68.316 | 62.928 | 71.285 | 53.718 | 56.942 | 56.625 | 63.561 | 49.849 |
| 14/01/2018 | 68.167 | 62.727 | 71.154 | 53.701 | 57.035 | 56.508 | 63.737 | 49.921 |
| 15/01/2018 | 68.338 | 62.918 | 71.172 | 53.691 | 56.93 | 56.392 | 63.344 | 49.941 |
| 16/01/2018 | 68.407 | 62.748 | 71.205 | 53.768 | 56.984 | 56.578 | 63.583 | 49.957 |
| 17/01/2018 | 68.348 | 62.666 | 71.318 | 53.921 | 57.018 | 56.508 | 63.576 | 49.987 |
| 18/01/2018 | 68.248 | 62.59 | 71.427 | 53.855 | 57.066 | 56.447 | 63.459 | 50.085 |
| 19/01/2018 | 68.228 | 62.752 | 71.322 | 53.839 | 56.952 | 56.664 | 63.427 | 49.985 |
| 20/01/2018 | 68.172 | 62.561 | 71.41 | 53.79 | 57.03 | 56.683 | 63.602 | 50.016 |
| 21/01/2018 | 68.243 | 62.576 | 71.411 | 53.854 | 57.19 | 56.569 | 63.541 | 50.033 |
| 22/01/2018 | 68.355 | 62.672 | 71.459 | 53.893 | 57.111 | 56.267 | 63.716 | 50.052 |
| 23/01/2018 | 68.341 | 62.683 | 71.546 | 53.946 | 57.093 | 56.55 | 63.887 | 50.012 |
| 24/01/2018 | 68.269 | 62.554 | 71.355 | 53.851 | 57.174 | 56.735 | 63.739 | 49.947 |
| 25/01/2018 | 68.289 | 62.73 | 71.365 | 53.776 | 57.155 | 56.804 | 63.636 | 50.027 |
| 26/01/2018 | 68.361 | 62.704 | 71.254 | 53.823 | 56.857 | 56.58 | 63.822 | 50.042 |
| 27/01/2018 | 68.356 | 62.601 | 71.319 | 53.777 | 57.134 | 56.787 | 63.69 | 49.951 |
| 28/01/2018 | 68.284 | 62.689 | 71.378 | 53.77 | 57.248 | 56.624 | 63.765 | 50.018 |
| 29/01/2018 | 68.236 | 62.742 | 71.412 | 53.936 | 57.189 | 56.837 | 63.556 | 50.169 |
| 30/01/2018 | 68.245 | 62.764 | 71.424 | 53.966 | 56.787 | 56.71 | 63.657 | 50.184 |
| 31/01/2018 | 68.142 | 62.774 | 71.474 | 53.845 | 57.136 | 56.948 | 63.965 | 50.009 |
| 01/02/2018 | 68.22 | 62.742 | 71.521 | 53.806 | 57.127 | 56.807 | 63.671 | 50.134 |
| 02/02/2018 | 68.222 | 62.85 | 71.473 | 53.703 | 56.894 | 56.677 | 63.481 | 49.973 |
| 03/02/2018 | 68.218 | 62.624 | 71.447 | 53.684 | 57.135 | 56.635 | 63.586 | 49.904 |
| 04/02/2018 | 68.274 | 62.774 | 71.507 | 53.766 | 57.373 | 56.862 | 63.556 | 50.08 |
| 05/02/2018 | 68.303 | 62.8 | 71.534 | 53.7 | 57.099 | 56.923 | 63.579 | 50.022 |
| 06/02/2018 | 68.218 | 62.919 | 71.384 | 53.614 | 56.899 | 56.66 | 63.537 | 49.914 |
| 07/02/2018 | 68.244 | 62.793 | 71.422 | 53.613 | 57.112 | 56.721 | 63.71 | 49.832 |
| 08/02/2018 | 68.244 | 62.938 | 71.521 | 53.547 | 56.936 | 56.544 | 63.715 | 49.837 |
| 09/02/2018 | 68.235 | 62.955 | 71.491 | 53.544 | 57.208 | 56.309 | 63.673 | 49.985 |
| 10/02/2018 | 68.145 | 62.817 | 71.428 | 53.622 | 57.092 | 56.506 | 63.928 | 49.847 |
| 11/02/2018 | 68.247 | 62.753 | 71.568 | 53.8 | 57.348 | 56.494 | 63.84 | 50.009 |
| 12/02/2018 | 68.277 | 62.764 | 71.553 | 53.845 | 57.171 | 56.586 | 63.714 | 50.036 |
| 13/02/2018 | 68.261 | 62.822 | 71.428 | 53.749 | 57.175 | 56.671 | 63.758 | 50.033 |
| 14/02/2018 | 68.369 | 62.886 | 71.466 | 53.947 | 57.241 | 56.45 | 64.047 | 50.139 |
| 15/02/2018 | 68.404 | 62.72 | 71.544 | 53.932 | 57.359 | 56.826 | 63.713 | 49.994 |
| 16/02/2018 | 68.443 | 62.876 | 71.523 | 54.172 | 57.413 | 56.728 | 63.717 | 50.101 |
| 17/02/2018 | 68.338 | 62.792 | 71.54 | 54.162 | 57.328 | 56.747 | 63.773 | 50.193 |
| 18/02/2018 | 68.363 | 62.663 | 71.571 | 54.036 | 57.54 | 56.434 | 63.923 | 50.113 |
| 19/02/2018 | 68.441 | 62.809 | 71.607 | 53.92 | 57.352 | 56.376 | 63.68 | 50.08 |
| 20/02/2018 | 68.317 | 62.786 | 71.545 | 53.969 | 57.391 | 56.5 | 63.577 | 50.091 |
| 21/02/2018 | 68.285 | 62.795 | 71.471 | 53.817 | 57.242 | 56.357 | 63.68 | 49.89 |
| 22/02/2018 | 68.279 | 62.893 | 71.451 | 53.87 | 56.903 | 56.308 | 63.673 | 49.822 |
| 23/02/2018 | 68.277 | 62.881 | 71.444 | 53.59 | 56.986 | 56.495 | 63.407 | 49.696 |
| 24/02/2018 | 68.409 | 62.849 | 71.597 | 53.65 | 57.221 | 56.692 | 63.657 | 49.726 |
| 25/02/2018 | 68.334 | 62.94 | 71.491 | 53.645 | 57.054 | 56.354 | 63.687 | 49.813 |
| 26/02/2018 | 68.285 | 62.62 | 71.377 | 53.79 | 57.21 | 56.396 | 63.766 | 49.773 |
| 27/02/2018 | 68.337 | 62.839 | 71.403 | 53.655 | 57.35 | 56.629 | 63.598 | 49.835 |
| 28/02/2018 | 68.462 | 62.972 | 71.621 | 53.618 | 57.388 | 56.618 | 63.673 | 49.837 |
| 01/03/2018 | 68.236 | 62.917 | 71.61 | 53.691 | 57.242 | 56.758 | 63.643 | 49.758 |
| 02/03/2018 | 68.429 | 62.847 | 71.536 | 53.725 | 57.287 | 56.813 | 63.673 | 49.788 |
| 03/03/2018 | 68.455 | 62.911 | 71.527 | 53.943 | 57.447 | 56.725 | 63.855 | 50.037 |
| 04/03/2018 | 68.469 | 62.89 | 71.677 | 54.007 | 57.359 | 56.739 | 63.829 | 50.009 |
| 05/03/2018 | 68.464 | 62.914 | 71.542 | 53.889 | 57.175 | 56.78 | 63.703 | 50.089 |
| 06/03/2018 | 68.439 | 62.842 | 71.611 | 53.921 | 57.275 | 56.656 | 63.645 | 49.927 |
| 07/03/2018 | 68.363 | 62.913 | 71.573 | 53.805 | 57.199 | 56.5 | 63.689 | 49.835 |
| 08/03/2018 | 68.376 | 62.639 | 71.595 | 53.76 | 57.43 | 56.486 | 63.717 | 49.797 |
| 09/03/2018 | 68.343 | 62.779 | 71.606 | 53.89 | 57.272 | 56.541 | 63.736 | 49.88 |
| 10/03/2018 | 68.499 | 62.775 | 71.641 | 54.142 | 57.082 | 56.508 | 63.843 | 49.921 |
| 11/03/2018 | 68.3 | 62.753 | 71.423 | 54.096 | 57.319 | 56.678 | 63.699 | 50.021 |
| 12/03/2018 | 68.438 | 62.772 | 71.563 | 53.985 | 57.248 | 56.699 | 63.666 | 49.917 |
| 13/03/2018 | 68.565 | 62.752 | 71.593 | 53.941 | 57.406 | 56.667 | 63.636 | 49.871 |
| 14/03/2018 | 68.562 | 62.885 | 71.549 | 53.925 | 57.023 | 56.801 | 63.467 | 49.911 |
| 15/03/2018 | 68.32 | 62.825 | 71.491 | 53.899 | 57.045 | 56.609 | 63.619 | 49.929 |
| 16/03/2018 | 68.504 | 62.828 | 71.538 | 53.849 | 56.886 | 56.404 | 63.598 | 49.914 |
| 17/03/2018 | 68.54 | 62.851 | 71.618 | 53.857 | 56.701 | 56.383 | 63.694 | 50 |
| 18/03/2018 | 68.553 | 62.925 | 71.612 | 53.783 | 56.941 | 56.451 | 63.829 | 50.019 |
| 19/03/2018 | 68.383 | 62.818 | 71.553 | 53.816 | 56.77 | 56.347 | 63.757 | 49.955 |
| 20/03/2018 | 68.342 | 62.981 | 71.503 | 53.77 | 56.746 | 56.62 | 63.666 | 49.816 |
| 21/03/2018 | 68.297 | 62.966 | 71.37 | 53.733 | 57.121 | 56.587 | 63.626 | 49.878 |
| 22/03/2018 | 68.494 | 62.769 | 71.4 | 53.728 | 56.924 | 56.566 | 63.593 | 49.858 |
| 23/03/2018 | 68.501 | 62.786 | 71.407 | 53.694 | 56.973 | 56.697 | 63.666 | 49.766 |
| 24/03/2018 | 68.327 | 62.965 | 71.469 | 53.819 | 56.436 | 56.369 | 63.778 | 49.691 |
| 25/03/2018 | 68.256 | 62.844 | 71.471 | 53.874 | 57.032 | 56.787 | 63.717 | 49.907 |
| 26/03/2018 | 68.372 | 62.837 | 71.418 | 53.963 | 56.839 | 56.612 | 63.636 | 49.852 |
| 27/03/2018 | 68.48 | 62.784 | 71.599 | 54.074 | 56.973 | 56.571 | 63.64 | 49.844 |
| 28/03/2018 | 68.374 | 62.676 | 71.522 | 54.243 | 56.959 | 56.333 | 63.706 | 49.985 |
| 29/03/2018 | 68.473 | 62.778 | 71.449 | 54.141 | 56.661 | 56.609 | 63.535 | 49.831 |
| 30/03/2018 | 68.45 | 62.9 | 71.397 | 54.049 | 56.725 | 56.783 | 63.589 | 50.025 |
| 31/03/2018 | 68.271 | 62.747 | 71.468 | 54.078 | 56.691 | 56.641 | 63.652 | 50.045 |
| 01/04/2018 | 68.414 | 62.68 | 71.565 | 54.098 | 56.83 | 56.527 | 63.666 | 50.065 |
| 02/04/2018 | 68.483 | 62.68 | 71.513 | 54.19 | 56.74 | 56.579 | 63.722 | 50.058 |
| 03/04/2018 | 68.45 | 62.562 | 71.482 | 54.192 | 56.897 | 56.75 | 63.631 | 50.086 |
| 04/04/2018 | 68.379 | 62.743 | 71.524 | 54.128 | 56.669 | 56.658 | 63.598 | 49.868 |
| 05/04/2018 | 68.272 | 62.618 | 71.466 | 54.218 | 56.589 | 56.658 | 63.624 | 49.864 |
| 06/04/2018 | 68.458 | 62.579 | 71.427 | 54.09 | 56.596 | 56.617 | 63.421 | 49.88 |
| 07/04/2018 | 68.498 | 62.838 | 71.614 | 54.131 | 56.745 | 56.242 | 63.722 | 50.053 |
| 08/04/2018 | 68.447 | 62.724 | 71.639 | 54.092 | 56.734 | 56.421 | 63.717 | 49.853 |
| 09/04/2018 | 68.406 | 62.7 | 71.529 | 53.997 | 56.623 | 56.704 | 63.699 | 49.751 |
| 10/04/2018 | 68.539 | 62.87 | 71.622 | 53.928 | 56.765 | 56.728 | 63.598 | 49.739 |
| 11/04/2018 | 68.423 | 62.932 | 71.493 | 53.778 | 56.698 | 56.804 | 63.643 | 49.713 |
| 12/04/2018 | 68.431 | 62.792 | 71.49 | 54.061 | 56.73 | 56.457 | 63.731 | 49.661 |
| 13/04/2018 | 68.533 | 62.924 | 71.531 | 53.969 | 56.725 | 56.766 | 63.682 | 49.589 |
| 14/04/2018 | 68.402 | 62.672 | 71.523 | 54.04 | 56.652 | 56.467 | 63.685 | 49.726 |
| 15/04/2018 | 68.456 | 62.743 | 71.536 | 54.122 | 56.936 | 56.658 | 63.757 | 49.851 |
| 16/04/2018 | 68.37 | 62.832 | 71.489 | 54.141 | 56.725 | 56.609 | 63.734 | 49.729 |
| 17/04/2018 | 68.437 | 62.611 | 71.462 | 54.221 | 56.772 | 56.788 | 63.75 | 49.711 |
| 18/04/2018 | 68.431 | 62.518 | 71.42 | 54.375 | 56.834 | 56.505 | 63.432 | 49.851 |
| 19/04/2018 | 68.424 | 62.511 | 71.305 | 54.384 | 56.878 | 56.459 | 63.773 | 49.778 |
| 20/04/2018 | 68.448 | 62.534 | 71.415 | 54.355 | 56.724 | 56.505 | 63.764 | 49.842 |
| 21/04/2018 | 68.453 | 62.562 | 71.531 | 54.28 | 56.646 | 56.565 | 63.764 | 49.717 |
| 22/04/2018 | 68.548 | 62.39 | 71.428 | 54.465 | 56.741 | 56.628 | 63.778 | 49.878 |
| 23/04/2018 | 68.384 | 62.621 | 71.433 | 54.479 | 56.909 | 56.204 | 63.301 | 49.847 |
| 24/04/2018 | 68.358 | 62.621 | 71.404 | 54.616 | 56.952 | 56.541 | 63.334 | 49.979 |
| 25/04/2018 | 68.465 | 62.578 | 71.418 | 54.507 | 57.003 | 56.459 | 63.407 | 49.909 |
| 26/04/2018 | 68.351 | 62.383 | 71.435 | 54.482 | 56.911 | 56.432 | 63.414 | 49.711 |
| 27/04/2018 | 68.348 | 62.51 | 71.42 | 54.423 | 56.921 | 56.351 | 63.009 | 49.784 |
| 28/04/2018 | 68.371 | 62.498 | 71.35 | 54.365 | 56.91 | 56.334 | 63.285 | 49.865 |
| 29/04/2018 | 68.29 | 62.715 | 71.287 | 54.204 | 56.529 | 56.53 | 63.456 | 49.774 |
| 30/04/2018 | 68.462 | 62.822 | 71.342 | 54.1 | 56.788 | 56.549 | 63.271 | 49.726 |
| 01/05/2018 | 68.463 | 62.635 | 71.398 | 54.11 | 56.729 | 56.269 | 63.243 | 49.807 |
| 02/05/2018 | 68.194 | 62.512 | 71.313 | 54.201 | 56.669 | 56.457 | 63.303 | 49.886 |
| 03/05/2018 | 68.219 | 62.545 | 71.248 | 54.252 | 56.609 | 56.37 | 63.143 | 49.631 |
| 04/05/2018 | 68.352 | 62.701 | 71.355 | 54.094 | 56.624 | 56.37 | 63.095 | 49.613 |
| 05/05/2018 | 68.293 | 62.526 | 71.306 | 54.254 | 56.904 | 56.111 | 63.174 | 49.826 |
| 06/05/2018 | 68.278 | 62.597 | 71.303 | 54.402 | 56.932 | 56.367 | 63.191 | 49.988 |